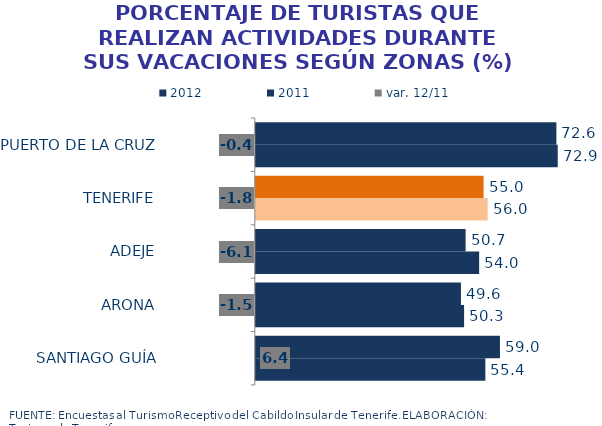
| Category | 2012 | 2011 |
|---|---|---|
| PUERTO DE LA CRUZ | 72.608 | 72.928 |
| TENERIFE | 55.027 | 56.009 |
| ADEJE | 50.68 | 53.951 |
| ARONA | 49.552 | 50.314 |
| SANTIAGO GUÍA | 58.971 | 55.446 |